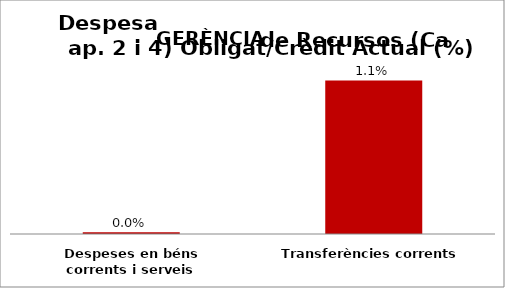
| Category | Series 0 |
|---|---|
| Despeses en béns corrents i serveis | 0 |
| Transferències corrents | 0.011 |